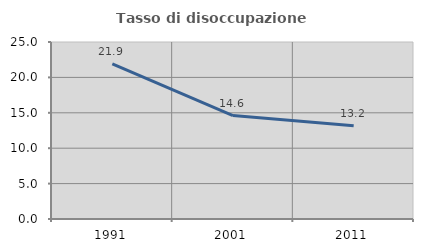
| Category | Tasso di disoccupazione giovanile  |
|---|---|
| 1991.0 | 21.893 |
| 2001.0 | 14.607 |
| 2011.0 | 13.158 |